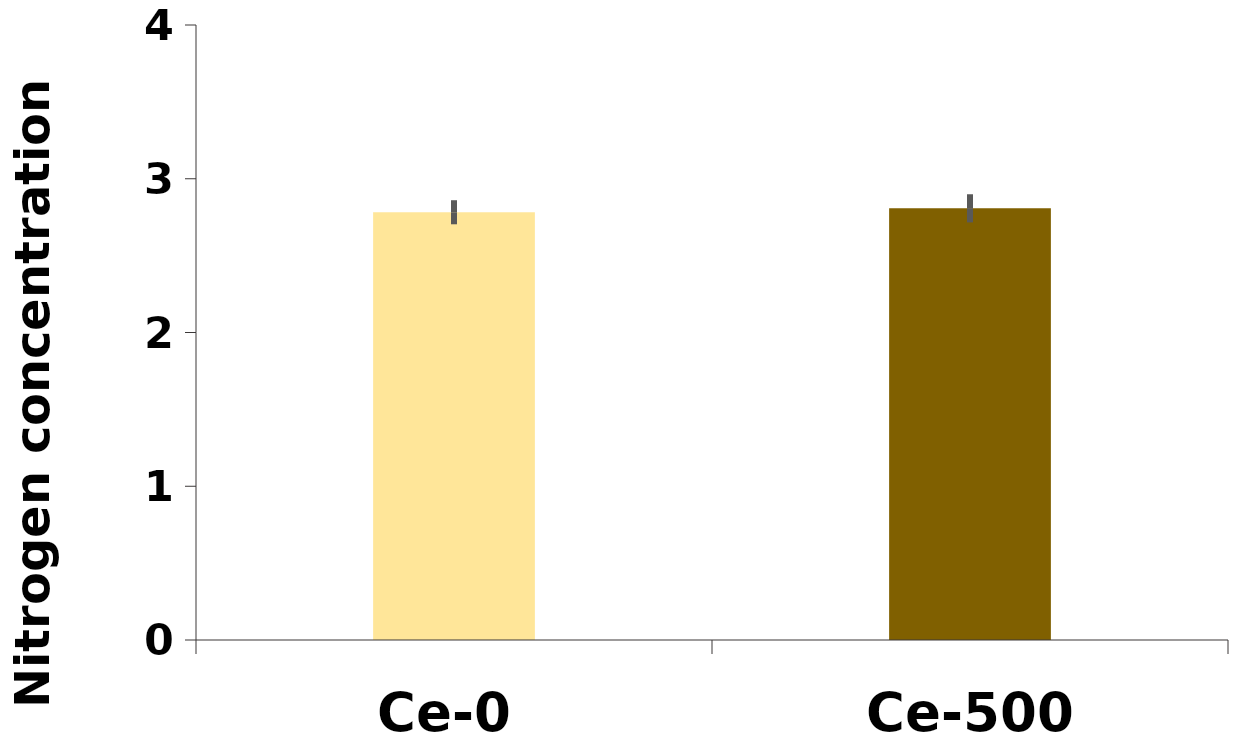
| Category | %N |
|---|---|
| Ce-0 | 2.782 |
| Ce-500 | 2.808 |